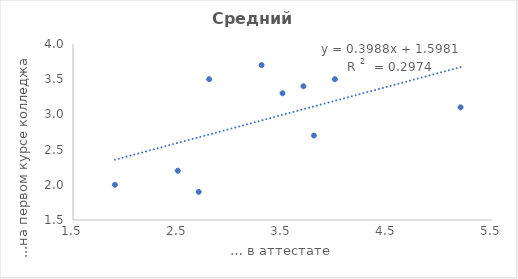
| Category | ...на первом курсе колледжа |
|---|---|
| 3.5 | 3.3 |
| 2.5 | 2.2 |
| 4.0 | 3.5 |
| 3.8 | 2.7 |
| 2.8 | 3.5 |
| 1.9 | 2 |
| 5.2 | 3.1 |
| 3.7 | 3.4 |
| 2.7 | 1.9 |
| 3.3 | 3.7 |